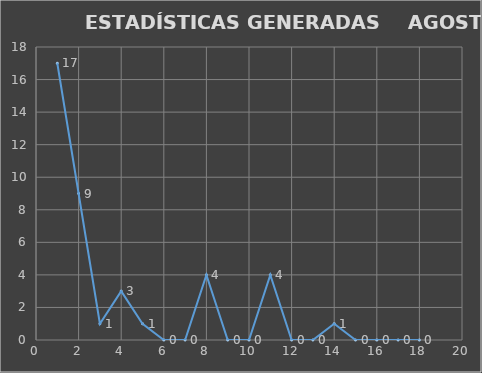
| Category |                   ESTADÍSTICAS GENERADAS     PERIODO AGOSTO 19 CANTIDAD |
|---|---|
| 0 | 17 |
| 1 | 9 |
| 2 | 1 |
| 3 | 3 |
| 4 | 1 |
| 5 | 0 |
| 6 | 0 |
| 7 | 4 |
| 8 | 0 |
| 9 | 0 |
| 10 | 4 |
| 11 | 0 |
| 12 | 0 |
| 13 | 1 |
| 14 | 0 |
| 15 | 0 |
| 16 | 0 |
| 17 | 0 |